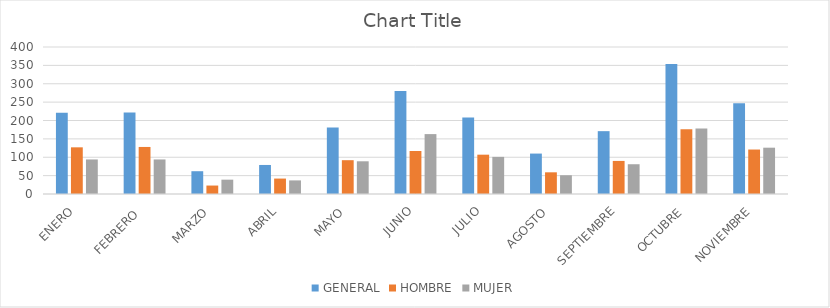
| Category | GENERAL | HOMBRE | MUJER |
|---|---|---|---|
| ENERO | 221 | 127 | 94 |
| FEBRERO  | 222 | 128 | 94 |
| MARZO | 62 | 23 | 39 |
| ABRIL | 79 | 42 | 37 |
| MAYO | 181 | 92 | 89 |
| JUNIO | 280 | 117 | 163 |
| JULIO | 208 | 107 | 101 |
| AGOSTO | 110 | 59 | 51 |
| SEPTIEMBRE | 171 | 90 | 81 |
| OCTUBRE | 354 | 176 | 178 |
| NOVIEMBRE | 247 | 121 | 126 |